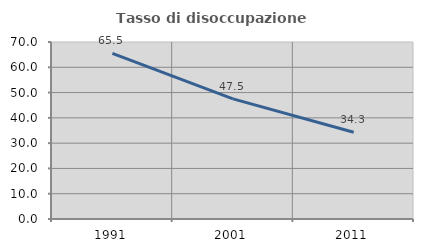
| Category | Tasso di disoccupazione giovanile  |
|---|---|
| 1991.0 | 65.517 |
| 2001.0 | 47.5 |
| 2011.0 | 34.286 |